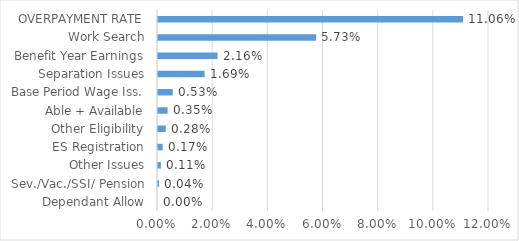
| Category | Series 0 |
|---|---|
| Dependant Allow | 0 |
| Sev./Vac./SSI/ Pension | 0 |
| Other Issues | 0.001 |
| ES Registration | 0.002 |
| Other Eligibility | 0.003 |
| Able + Available | 0.003 |
| Base Period Wage Iss. | 0.005 |
| Separation Issues | 0.017 |
| Benefit Year Earnings | 0.022 |
| Work Search | 0.057 |
| OVERPAYMENT RATE | 0.111 |